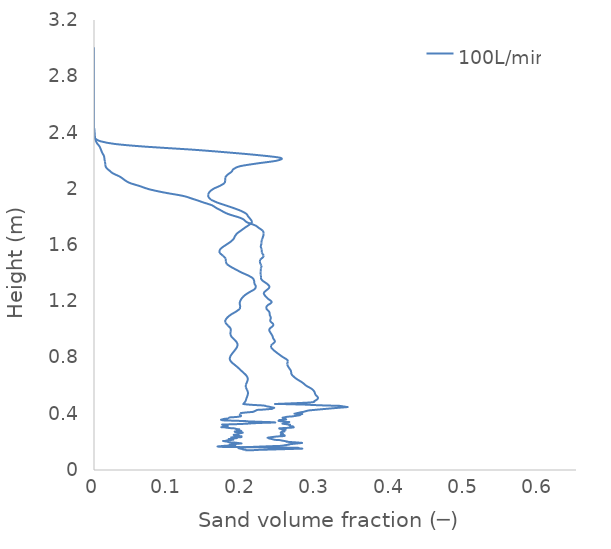
| Category | 100L/min |
|---|---|
| 0.204105 | 0.14 |
| 0.204226 | 0.144 |
| 0.201159 | 0.145 |
| 0.201422 | 0.146 |
| 0.200742 | 0.148 |
| 0.200565 | 0.148 |
| 0.198772 | 0.15 |
| 0.194805 | 0.155 |
| 0.196507 | 0.16 |
| 0.200508 | 0.161 |
| 0.206771 | 0.163 |
| 0.218301 | 0.165 |
| 0.219104 | 0.165 |
| 0.245378 | 0.171 |
| 0.252265 | 0.172 |
| 0.257247 | 0.176 |
| 0.261314 | 0.179 |
| 0.262952 | 0.181 |
| 0.263732 | 0.181 |
| 0.263327 | 0.181 |
| 0.263649 | 0.182 |
| 0.262595 | 0.182 |
| 0.263284 | 0.183 |
| 0.266349 | 0.185 |
| 0.279063 | 0.192 |
| 0.278504 | 0.194 |
| 0.260959 | 0.2 |
| 0.260797 | 0.201 |
| 0.260444 | 0.201 |
| 0.260481 | 0.201 |
| 0.260679 | 0.202 |
| 0.260921 | 0.202 |
| 0.250166 | 0.213 |
| 0.249446 | 0.213 |
| 0.24764 | 0.214 |
| 0.245402 | 0.214 |
| 0.244218 | 0.215 |
| 0.236442 | 0.224 |
| 0.236364 | 0.225 |
| 0.237278 | 0.225 |
| 0.238736 | 0.226 |
| 0.238569 | 0.227 |
| 0.235431 | 0.229 |
| 0.234488 | 0.23 |
| 0.244117 | 0.237 |
| 0.248574 | 0.239 |
| 0.256824 | 0.242 |
| 0.256094 | 0.249 |
| 0.255743 | 0.25 |
| 0.254384 | 0.25 |
| 0.254091 | 0.251 |
| 0.254163 | 0.251 |
| 0.252108 | 0.252 |
| 0.252136 | 0.252 |
| 0.252148 | 0.252 |
| 0.254625 | 0.259 |
| 0.254173 | 0.259 |
| 0.251995 | 0.265 |
| 0.251836 | 0.265 |
| 0.252849 | 0.266 |
| 0.253248 | 0.266 |
| 0.253019 | 0.273 |
| 0.256644 | 0.274 |
| 0.256638 | 0.274 |
| 0.25657 | 0.275 |
| 0.256082 | 0.275 |
| 0.256063 | 0.275 |
| 0.255017 | 0.279 |
| 0.256793 | 0.284 |
| 0.257544 | 0.285 |
| 0.257987 | 0.286 |
| 0.257864 | 0.286 |
| 0.250592 | 0.293 |
| 0.249885 | 0.296 |
| 0.249868 | 0.296 |
| 0.24989 | 0.296 |
| 0.249978 | 0.297 |
| 0.253351 | 0.298 |
| 0.255105 | 0.298 |
| 0.268471 | 0.302 |
| 0.268027 | 0.307 |
| 0.267947 | 0.308 |
| 0.268489 | 0.308 |
| 0.268843 | 0.308 |
| 0.268463 | 0.309 |
| 0.267536 | 0.311 |
| 0.266533 | 0.311 |
| 0.264895 | 0.312 |
| 0.262963 | 0.321 |
| 0.263958 | 0.322 |
| 0.263676 | 0.323 |
| 0.254672 | 0.329 |
| 0.255324 | 0.33 |
| 0.256778 | 0.331 |
| 0.257971 | 0.332 |
| 0.257046 | 0.333 |
| 0.256832 | 0.333 |
| 0.256768 | 0.333 |
| 0.2632 | 0.341 |
| 0.260582 | 0.342 |
| 0.258161 | 0.343 |
| 0.255576 | 0.345 |
| 0.24971 | 0.348 |
| 0.249697 | 0.348 |
| 0.249637 | 0.348 |
| 0.24967 | 0.348 |
| 0.248862 | 0.35 |
| 0.249093 | 0.351 |
| 0.25 | 0.355 |
| 0.250043 | 0.355 |
| 0.25729 | 0.359 |
| 0.258676 | 0.36 |
| 0.259168 | 0.36 |
| 0.258627 | 0.361 |
| 0.258092 | 0.362 |
| 0.258045 | 0.363 |
| 0.257706 | 0.37 |
| 0.255224 | 0.371 |
| 0.254391 | 0.372 |
| 0.256595 | 0.374 |
| 0.260964 | 0.379 |
| 0.262923 | 0.38 |
| 0.267059 | 0.381 |
| 0.275166 | 0.388 |
| 0.275271 | 0.388 |
| 0.276407 | 0.389 |
| 0.277232 | 0.389 |
| 0.277711 | 0.39 |
| 0.276313 | 0.392 |
| 0.275247 | 0.394 |
| 0.280879 | 0.398 |
| 0.271054 | 0.401 |
| 0.271151 | 0.401 |
| 0.271226 | 0.401 |
| 0.279372 | 0.411 |
| 0.280442 | 0.412 |
| 0.280841 | 0.412 |
| 0.281773 | 0.413 |
| 0.281842 | 0.413 |
| 0.282021 | 0.413 |
| 0.285464 | 0.418 |
| 0.289219 | 0.423 |
| 0.289859 | 0.424 |
| 0.291388 | 0.424 |
| 0.291651 | 0.425 |
| 0.308593 | 0.433 |
| 0.316658 | 0.436 |
| 0.316792 | 0.437 |
| 0.318606 | 0.437 |
| 0.329899 | 0.442 |
| 0.341111 | 0.447 |
| 0.34134 | 0.447 |
| 0.341447 | 0.447 |
| 0.342103 | 0.448 |
| 0.341721 | 0.448 |
| 0.34169 | 0.448 |
| 0.339937 | 0.449 |
| 0.338631 | 0.45 |
| 0.331106 | 0.456 |
| 0.327426 | 0.457 |
| 0.323966 | 0.457 |
| 0.30483 | 0.46 |
| 0.285034 | 0.465 |
| 0.284581 | 0.465 |
| 0.24821 | 0.47 |
| 0.247846 | 0.47 |
| 0.247413 | 0.47 |
| 0.24729 | 0.47 |
| 0.291787 | 0.48 |
| 0.297446 | 0.491 |
| 0.300758 | 0.501 |
| 0.302123 | 0.511 |
| 0.301202 | 0.522 |
| 0.299174 | 0.532 |
| 0.298109 | 0.542 |
| 0.297511 | 0.553 |
| 0.296304 | 0.563 |
| 0.294468 | 0.574 |
| 0.291466 | 0.584 |
| 0.287768 | 0.594 |
| 0.28488 | 0.605 |
| 0.282684 | 0.615 |
| 0.28003 | 0.625 |
| 0.27683 | 0.636 |
| 0.273654 | 0.646 |
| 0.271006 | 0.656 |
| 0.268793 | 0.667 |
| 0.266903 | 0.677 |
| 0.265978 | 0.687 |
| 0.265825 | 0.698 |
| 0.265265 | 0.708 |
| 0.263944 | 0.718 |
| 0.26265 | 0.729 |
| 0.261481 | 0.739 |
| 0.260585 | 0.75 |
| 0.260701 | 0.76 |
| 0.261411 | 0.77 |
| 0.261063 | 0.781 |
| 0.258554 | 0.791 |
| 0.255175 | 0.801 |
| 0.252291 | 0.812 |
| 0.249612 | 0.822 |
| 0.246974 | 0.832 |
| 0.244437 | 0.843 |
| 0.24212 | 0.853 |
| 0.240124 | 0.863 |
| 0.238628 | 0.874 |
| 0.238535 | 0.884 |
| 0.240288 | 0.894 |
| 0.242803 | 0.905 |
| 0.244016 | 0.915 |
| 0.243015 | 0.926 |
| 0.241667 | 0.936 |
| 0.24108 | 0.946 |
| 0.240299 | 0.957 |
| 0.239143 | 0.967 |
| 0.237874 | 0.977 |
| 0.236721 | 0.988 |
| 0.236345 | 0.998 |
| 0.237565 | 1.008 |
| 0.240027 | 1.019 |
| 0.241839 | 1.029 |
| 0.241427 | 1.039 |
| 0.239264 | 1.05 |
| 0.23765 | 1.06 |
| 0.23793 | 1.07 |
| 0.238515 | 1.081 |
| 0.237966 | 1.091 |
| 0.237047 | 1.102 |
| 0.23685 | 1.112 |
| 0.236575 | 1.122 |
| 0.234912 | 1.133 |
| 0.233 | 1.143 |
| 0.232405 | 1.153 |
| 0.232872 | 1.164 |
| 0.23482 | 1.174 |
| 0.238092 | 1.184 |
| 0.239626 | 1.195 |
| 0.23795 | 1.205 |
| 0.235199 | 1.215 |
| 0.233055 | 1.226 |
| 0.231251 | 1.236 |
| 0.22967 | 1.246 |
| 0.22898 | 1.257 |
| 0.230072 | 1.267 |
| 0.232426 | 1.278 |
| 0.23486 | 1.288 |
| 0.236436 | 1.298 |
| 0.236235 | 1.309 |
| 0.234538 | 1.319 |
| 0.232023 | 1.329 |
| 0.22905 | 1.34 |
| 0.226599 | 1.35 |
| 0.225326 | 1.36 |
| 0.225046 | 1.371 |
| 0.225049 | 1.381 |
| 0.224763 | 1.391 |
| 0.224616 | 1.402 |
| 0.224727 | 1.412 |
| 0.224731 | 1.422 |
| 0.225057 | 1.433 |
| 0.225761 | 1.443 |
| 0.225708 | 1.454 |
| 0.224699 | 1.464 |
| 0.223903 | 1.474 |
| 0.223635 | 1.485 |
| 0.224018 | 1.495 |
| 0.226203 | 1.505 |
| 0.228642 | 1.516 |
| 0.228764 | 1.526 |
| 0.227386 | 1.536 |
| 0.226329 | 1.547 |
| 0.226216 | 1.557 |
| 0.226183 | 1.567 |
| 0.225517 | 1.578 |
| 0.224909 | 1.588 |
| 0.225201 | 1.598 |
| 0.225811 | 1.609 |
| 0.225783 | 1.619 |
| 0.2259 | 1.63 |
| 0.226706 | 1.64 |
| 0.227344 | 1.65 |
| 0.227962 | 1.661 |
| 0.228604 | 1.671 |
| 0.228759 | 1.681 |
| 0.228657 | 1.692 |
| 0.227613 | 1.702 |
| 0.22474 | 1.713 |
| 0.221507 | 1.724 |
| 0.21866 | 1.736 |
| 0.213447 | 1.748 |
| 0.207496 | 1.759 |
| 0.204233 | 1.769 |
| 0.202309 | 1.779 |
| 0.198779 | 1.79 |
| 0.19317 | 1.8 |
| 0.186576 | 1.81 |
| 0.180691 | 1.821 |
| 0.176154 | 1.831 |
| 0.172621 | 1.842 |
| 0.169131 | 1.852 |
| 0.165334 | 1.862 |
| 0.162232 | 1.873 |
| 0.158889 | 1.883 |
| 0.153104 | 1.893 |
| 0.146794 | 1.904 |
| 0.141336 | 1.914 |
| 0.13525 | 1.924 |
| 0.129353 | 1.935 |
| 0.123288 | 1.945 |
| 0.113942 | 1.955 |
| 0.102303 | 1.966 |
| 0.0916877 | 1.976 |
| 0.0823727 | 1.986 |
| 0.0741455 | 1.997 |
| 0.0678925 | 2.007 |
| 0.062571 | 2.018 |
| 0.0560619 | 2.028 |
| 0.0497562 | 2.038 |
| 0.0453182 | 2.049 |
| 0.0421051 | 2.059 |
| 0.039444 | 2.069 |
| 0.0368498 | 2.08 |
| 0.0334583 | 2.09 |
| 0.0290401 | 2.1 |
| 0.0250715 | 2.111 |
| 0.0225642 | 2.121 |
| 0.0203138 | 2.131 |
| 0.0179485 | 2.142 |
| 0.016318 | 2.152 |
| 0.015514 | 2.162 |
| 0.0151986 | 2.173 |
| 0.0151001 | 2.183 |
| 0.0147956 | 2.194 |
| 0.014306 | 2.204 |
| 0.0140506 | 2.214 |
| 0.0138285 | 2.225 |
| 0.0132752 | 2.235 |
| 0.0121941 | 2.245 |
| 0.0110814 | 2.256 |
| 0.010238 | 2.266 |
| 0.00946813 | 2.276 |
| 0.00872256 | 2.287 |
| 0.00784799 | 2.297 |
| 0.00652801 | 2.307 |
| 0.0049018 | 2.318 |
| 0.00354381 | 2.328 |
| 0.00261492 | 2.338 |
| 0.00197286 | 2.349 |
| 0.00153838 | 2.359 |
| 0.00124549 | 2.37 |
| 0.00105184 | 2.38 |
| 0.000924085 | 2.39 |
| 0.000836539 | 2.401 |
| 0.000716507 | 2.411 |
| 0.000481899 | 2.421 |
| 0.000189248 | 2.432 |
| 2.65643e-05 | 2.442 |
| 3.52986e-06 | 2.452 |
| 3.48474e-06 | 2.463 |
| 3.38725e-06 | 2.473 |
| 3.21296e-06 | 2.483 |
| 3.03475e-06 | 2.494 |
| 2.81798e-06 | 2.504 |
| 2.58286e-06 | 2.514 |
| 2.35581e-06 | 2.525 |
| 2.13502e-06 | 2.535 |
| 1.87229e-06 | 2.546 |
| 1.55078e-06 | 2.556 |
| 1.22405e-06 | 2.566 |
| 9.49886e-07 | 2.577 |
| 7.58498e-07 | 2.587 |
| 6.11774e-07 | 2.597 |
| 5.19245e-07 | 2.608 |
| 4.07956e-07 | 2.618 |
| 1.59557e-07 | 2.628 |
| 2.12182e-09 | 2.639 |
| 3.99085e-14 | 2.649 |
| 1.74661e-22 | 2.659 |
| 0.0 | 2.67 |
| 0.0 | 2.68 |
| 0.0 | 2.69 |
| 0.0 | 2.701 |
| 0.0 | 2.711 |
| 0.0 | 2.722 |
| 0.0 | 2.732 |
| 0.0 | 2.742 |
| 0.0 | 2.753 |
| 0.0 | 2.763 |
| 0.0 | 2.773 |
| 0.0 | 2.784 |
| 0.0 | 2.794 |
| 0.0 | 2.804 |
| 0.0 | 2.815 |
| 0.0 | 2.825 |
| 0.0 | 2.835 |
| 0.0 | 2.846 |
| 0.0 | 2.856 |
| 0.0 | 2.866 |
| 0.0 | 2.877 |
| 0.0 | 2.887 |
| 0.0 | 2.898 |
| 0.0 | 2.908 |
| 0.0 | 2.918 |
| 0.0 | 2.929 |
| 0.0 | 2.939 |
| 0.0 | 2.949 |
| 0.0 | 2.96 |
| 0.0 | 2.97 |
| 0.0 | 2.97 |
| 0.0 | 2.98 |
| 0.0 | 2.99 |
| 0.0 | 3 |
| 0.0 | 3 |
| 0.0 | 3 |
| 0.0 | 3 |
| 0.0 | 3 |
| 0.0 | 3 |
| 0.0 | 3 |
| 0.0 | 3 |
| 0.0 | 3 |
| 0.0 | 3 |
| 0.0 | 3 |
| 0.0 | 3 |
| 0.0 | 3 |
| 0.0 | 3 |
| 0.0 | 3 |
| 0.0 | 3 |
| 0.0 | 3 |
| 0.0 | 3 |
| 0.0 | 3 |
| 0.0 | 3 |
| 0.0 | 3 |
| 0.0 | 3 |
| 0.0 | 3 |
| 0.0 | 3 |
| 0.0 | 3 |
| 0.0 | 2.997 |
| 0.0 | 2.988 |
| 0.0 | 2.978 |
| 0.0 | 2.969 |
| 0.0 | 2.959 |
| 0.0 | 2.95 |
| 0.0 | 2.94 |
| 0.0 | 2.93 |
| 0.0 | 2.92 |
| 0.0 | 2.91 |
| 0.0 | 2.9 |
| 0.0 | 2.89 |
| 0.0 | 2.88 |
| 0.0 | 2.87 |
| 0.0 | 2.86 |
| 0.0 | 2.85 |
| 0.0 | 2.83 |
| 0.0 | 2.811 |
| 0.0 | 2.791 |
| 0.0 | 2.771 |
| 0.0 | 2.752 |
| 0.0 | 2.732 |
| 0.0 | 2.712 |
| 0.0 | 2.692 |
| 0.0 | 2.673 |
| 0.0 | 2.653 |
| 0.0 | 2.633 |
| 0.0 | 2.614 |
| 0.0 | 2.594 |
| 0.0 | 2.574 |
| 1.28395e-27 | 2.555 |
| 1.79573e-16 | 2.535 |
| 2.24475e-10 | 2.515 |
| 7.127e-08 | 2.495 |
| 7.18655e-08 | 2.476 |
| 1.39703e-08 | 2.456 |
| 1.10273e-07 | 2.436 |
| 9.90839e-08 | 2.417 |
| 2.36597e-07 | 2.397 |
| 4.25246e-05 | 2.377 |
| 0.00119817 | 2.358 |
| 0.00858698 | 2.338 |
| 0.0285053 | 2.318 |
| 0.0713383 | 2.298 |
| 0.130717 | 2.279 |
| 0.178487 | 2.259 |
| 0.220632 | 2.239 |
| 0.251528 | 2.22 |
| 0.246785 | 2.2 |
| 0.220217 | 2.18 |
| 0.196907 | 2.16 |
| 0.188294 | 2.14 |
| 0.185442 | 2.12 |
| 0.180299 | 2.101 |
| 0.17686 | 2.081 |
| 0.177093 | 2.061 |
| 0.176351 | 2.041 |
| 0.170027 | 2.021 |
| 0.161673 | 2.001 |
| 0.156432 | 1.981 |
| 0.153898 | 1.961 |
| 0.154004 | 1.941 |
| 0.157879 | 1.922 |
| 0.166225 | 1.902 |
| 0.177439 | 1.882 |
| 0.188608 | 1.862 |
| 0.198536 | 1.842 |
| 0.205329 | 1.822 |
| 0.208038 | 1.802 |
| 0.211192 | 1.782 |
| 0.212991 | 1.763 |
| 0.209043 | 1.743 |
| 0.203463 | 1.723 |
| 0.198268 | 1.703 |
| 0.193106 | 1.683 |
| 0.190134 | 1.663 |
| 0.188259 | 1.643 |
| 0.184275 | 1.623 |
| 0.178747 | 1.603 |
| 0.173113 | 1.584 |
| 0.169059 | 1.564 |
| 0.169316 | 1.544 |
| 0.173833 | 1.524 |
| 0.177591 | 1.504 |
| 0.177724 | 1.484 |
| 0.178883 | 1.464 |
| 0.184702 | 1.444 |
| 0.19168 | 1.424 |
| 0.198859 | 1.405 |
| 0.207436 | 1.385 |
| 0.207436 | 1.385 |
| 0.213949 | 1.365 |
| 0.215973 | 1.345 |
| 0.21643 | 1.325 |
| 0.21831 | 1.305 |
| 0.216412 | 1.285 |
| 0.209887 | 1.265 |
| 0.20405 | 1.246 |
| 0.200014 | 1.226 |
| 0.197564 | 1.206 |
| 0.196412 | 1.186 |
| 0.197235 | 1.166 |
| 0.196748 | 1.146 |
| 0.191507 | 1.126 |
| 0.185032 | 1.106 |
| 0.18022 | 1.086 |
| 0.177101 | 1.067 |
| 0.177193 | 1.047 |
| 0.180688 | 1.027 |
| 0.184122 | 1.007 |
| 0.184424 | 0.987 |
| 0.183735 | 0.967 |
| 0.185508 | 0.947 |
| 0.189204 | 0.927 |
| 0.192553 | 0.907 |
| 0.193638 | 0.888 |
| 0.192131 | 0.868 |
| 0.189361 | 0.848 |
| 0.186364 | 0.828 |
| 0.183874 | 0.808 |
| 0.183115 | 0.788 |
| 0.185182 | 0.768 |
| 0.18959 | 0.748 |
| 0.194111 | 0.729 |
| 0.198071 | 0.709 |
| 0.20222 | 0.689 |
| 0.205837 | 0.669 |
| 0.207394 | 0.649 |
| 0.206623 | 0.629 |
| 0.204906 | 0.609 |
| 0.204631 | 0.589 |
| 0.206436 | 0.569 |
| 0.207643 | 0.55 |
| 0.207033 | 0.53 |
| 0.20561 | 0.51 |
| 0.204322 | 0.49 |
| 0.201504 | 0.47 |
| 0.201483 | 0.47 |
| 0.201427 | 0.47 |
| 0.201607 | 0.469 |
| 0.201855 | 0.469 |
| 0.202202 | 0.469 |
| 0.202446 | 0.468 |
| 0.204231 | 0.467 |
| 0.204432 | 0.467 |
| 0.204488 | 0.467 |
| 0.204647 | 0.467 |
| 0.207137 | 0.466 |
| 0.207148 | 0.466 |
| 0.208292 | 0.465 |
| 0.208807 | 0.465 |
| 0.211185 | 0.464 |
| 0.218125 | 0.462 |
| 0.22046 | 0.461 |
| 0.221792 | 0.46 |
| 0.221905 | 0.46 |
| 0.228072 | 0.459 |
| 0.228609 | 0.459 |
| 0.230261 | 0.457 |
| 0.23062 | 0.457 |
| 0.230735 | 0.457 |
| 0.231155 | 0.457 |
| 0.231562 | 0.455 |
| 0.23488 | 0.451 |
| 0.237426 | 0.449 |
| 0.237503 | 0.448 |
| 0.237708 | 0.448 |
| 0.240379 | 0.445 |
| 0.242165 | 0.443 |
| 0.242896 | 0.442 |
| 0.242965 | 0.442 |
| 0.242129 | 0.441 |
| 0.242139 | 0.44 |
| 0.241815 | 0.44 |
| 0.240071 | 0.435 |
| 0.239914 | 0.435 |
| 0.228853 | 0.43 |
| 0.227025 | 0.429 |
| 0.226917 | 0.429 |
| 0.226698 | 0.429 |
| 0.221037 | 0.428 |
| 0.220557 | 0.427 |
| 0.219779 | 0.427 |
| 0.219413 | 0.426 |
| 0.218486 | 0.423 |
| 0.215989 | 0.417 |
| 0.215429 | 0.416 |
| 0.21538 | 0.415 |
| 0.214225 | 0.414 |
| 0.213472 | 0.413 |
| 0.206199 | 0.41 |
| 0.204965 | 0.409 |
| 0.200387 | 0.406 |
| 0.199308 | 0.406 |
| 0.198397 | 0.405 |
| 0.198209 | 0.405 |
| 0.19819 | 0.405 |
| 0.197931 | 0.405 |
| 0.197938 | 0.405 |
| 0.198007 | 0.404 |
| 0.197527 | 0.401 |
| 0.197581 | 0.396 |
| 0.196909 | 0.395 |
| 0.196738 | 0.395 |
| 0.196796 | 0.394 |
| 0.198291 | 0.385 |
| 0.19772 | 0.385 |
| 0.197103 | 0.384 |
| 0.197808 | 0.382 |
| 0.195772 | 0.38 |
| 0.192374 | 0.377 |
| 0.183306 | 0.374 |
| 0.182013 | 0.373 |
| 0.182014 | 0.371 |
| 0.180656 | 0.369 |
| 0.180267 | 0.366 |
| 0.178856 | 0.365 |
| 0.176715 | 0.364 |
| 0.175015 | 0.363 |
| 0.172038 | 0.358 |
| 0.171298 | 0.357 |
| 0.172876 | 0.355 |
| 0.173926 | 0.353 |
| 0.184517 | 0.351 |
| 0.188274 | 0.351 |
| 0.203164 | 0.348 |
| 0.204431 | 0.347 |
| 0.206667 | 0.346 |
| 0.224665 | 0.343 |
| 0.2272 | 0.342 |
| 0.228995 | 0.342 |
| 0.235968 | 0.341 |
| 0.240687 | 0.34 |
| 0.240687 | 0.34 |
| 0.244483 | 0.338 |
| 0.238336 | 0.337 |
| 0.236748 | 0.337 |
| 0.228393 | 0.335 |
| 0.225181 | 0.334 |
| 0.224477 | 0.334 |
| 0.214757 | 0.333 |
| 0.20683 | 0.329 |
| 0.205529 | 0.329 |
| 0.198538 | 0.327 |
| 0.187327 | 0.325 |
| 0.182804 | 0.325 |
| 0.173228 | 0.323 |
| 0.174037 | 0.322 |
| 0.174428 | 0.321 |
| 0.17543 | 0.32 |
| 0.177273 | 0.318 |
| 0.179615 | 0.316 |
| 0.178234 | 0.315 |
| 0.177272 | 0.315 |
| 0.178378 | 0.314 |
| 0.178856 | 0.313 |
| 0.180199 | 0.311 |
| 0.174624 | 0.309 |
| 0.173751 | 0.307 |
| 0.172223 | 0.305 |
| 0.172105 | 0.304 |
| 0.178282 | 0.302 |
| 0.178433 | 0.301 |
| 0.178446 | 0.301 |
| 0.183225 | 0.298 |
| 0.186401 | 0.297 |
| 0.18918 | 0.296 |
| 0.190713 | 0.294 |
| 0.191528 | 0.291 |
| 0.191543 | 0.291 |
| 0.191619 | 0.291 |
| 0.195361 | 0.29 |
| 0.195829 | 0.29 |
| 0.193876 | 0.287 |
| 0.193517 | 0.287 |
| 0.194409 | 0.286 |
| 0.192706 | 0.284 |
| 0.19458 | 0.282 |
| 0.195364 | 0.282 |
| 0.197409 | 0.28 |
| 0.198497 | 0.278 |
| 0.197619 | 0.278 |
| 0.190163 | 0.274 |
| 0.190616 | 0.274 |
| 0.190422 | 0.272 |
| 0.189936 | 0.271 |
| 0.190465 | 0.27 |
| 0.192879 | 0.268 |
| 0.200506 | 0.266 |
| 0.197749 | 0.262 |
| 0.19687 | 0.261 |
| 0.197311 | 0.261 |
| 0.19687 | 0.261 |
| 0.196063 | 0.26 |
| 0.196025 | 0.259 |
| 0.195973 | 0.258 |
| 0.194671 | 0.256 |
| 0.193517 | 0.254 |
| 0.191971 | 0.252 |
| 0.190065 | 0.251 |
| 0.188477 | 0.251 |
| 0.18894 | 0.247 |
| 0.190431 | 0.246 |
| 0.191228 | 0.245 |
| 0.193728 | 0.242 |
| 0.198364 | 0.24 |
| 0.198891 | 0.239 |
| 0.196436 | 0.237 |
| 0.197549 | 0.235 |
| 0.198526 | 0.234 |
| 0.190662 | 0.233 |
| 0.188039 | 0.233 |
| 0.184928 | 0.232 |
| 0.186654 | 0.228 |
| 0.187213 | 0.227 |
| 0.192761 | 0.226 |
| 0.186329 | 0.224 |
| 0.186156 | 0.223 |
| 0.185748 | 0.221 |
| 0.181623 | 0.22 |
| 0.187572 | 0.216 |
| 0.187439 | 0.216 |
| 0.186481 | 0.215 |
| 0.185492 | 0.214 |
| 0.184495 | 0.213 |
| 0.180463 | 0.211 |
| 0.178289 | 0.209 |
| 0.177813 | 0.208 |
| 0.179234 | 0.207 |
| 0.175465 | 0.206 |
| 0.174311 | 0.206 |
| 0.179521 | 0.202 |
| 0.179951 | 0.201 |
| 0.181602 | 0.198 |
| 0.18265 | 0.198 |
| 0.186437 | 0.195 |
| 0.190084 | 0.195 |
| 0.197998 | 0.19 |
| 0.198096 | 0.19 |
| 0.198807 | 0.189 |
| 0.198943 | 0.189 |
| 0.198064 | 0.189 |
| 0.196468 | 0.188 |
| 0.197054 | 0.188 |
| 0.186062 | 0.183 |
| 0.183669 | 0.181 |
| 0.183089 | 0.18 |
| 0.187162 | 0.178 |
| 0.187162 | 0.178 |
| 0.190518 | 0.177 |
| 0.188847 | 0.177 |
| 0.180921 | 0.174 |
| 0.175125 | 0.171 |
| 0.17494 | 0.171 |
| 0.167291 | 0.168 |
| 0.167006 | 0.168 |
| 0.168224 | 0.166 |
| 0.170148 | 0.165 |
| 0.169676 | 0.165 |
| 0.171761 | 0.165 |
| 0.186427 | 0.163 |
| 0.269288 | 0.159 |
| 0.26927 | 0.158 |
| 0.269492 | 0.158 |
| 0.279911 | 0.153 |
| 0.280414 | 0.152 |
| 0.278532 | 0.152 |
| 0.277119 | 0.151 |
| 0.247629 | 0.147 |
| 0.238296 | 0.145 |
| 0.237965 | 0.145 |
| 0.22171 | 0.143 |
| 0.21873 | 0.142 |
| 0.204105 | 0.14 |